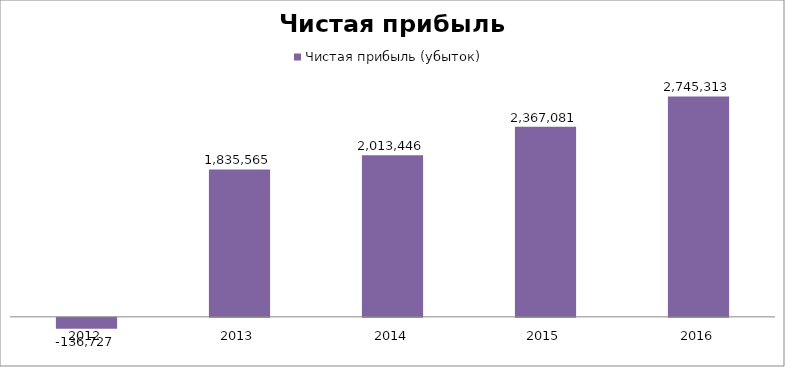
| Category | Чистая прибыль (убыток) |
|---|---|
| 2012.0 | -136727.211 |
| 2013.0 | 1835564.994 |
| 2014.0 | 2013446.221 |
| 2015.0 | 2367080.701 |
| 2016.0 | 2745312.542 |